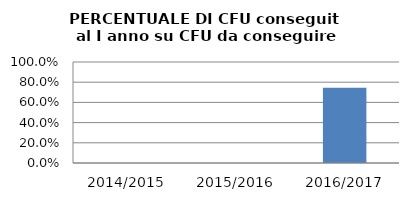
| Category | 2014/2015 2015/2016 2016/2017 |
|---|---|
| 2014/2015 | 0 |
| 2015/2016 | 0 |
| 2016/2017 | 0.746 |